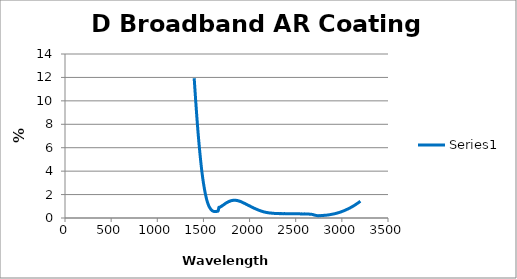
| Category | Series 0 |
|---|---|
| 1400.0 | 11.934 |
| 1410.0 | 10.726 |
| 1420.0 | 9.582 |
| 1430.0 | 8.487 |
| 1440.0 | 7.468 |
| 1450.0 | 6.535 |
| 1460.0 | 5.68 |
| 1470.0 | 4.892 |
| 1480.0 | 4.174 |
| 1490.0 | 3.551 |
| 1500.0 | 2.998 |
| 1510.0 | 2.523 |
| 1520.0 | 2.099 |
| 1530.0 | 1.743 |
| 1540.0 | 1.441 |
| 1550.0 | 1.202 |
| 1560.0 | 1.005 |
| 1570.0 | 0.864 |
| 1580.0 | 0.747 |
| 1590.0 | 0.654 |
| 1600.0 | 0.6 |
| 1610.0 | 0.568 |
| 1620.0 | 0.547 |
| 1630.0 | 0.546 |
| 1640.0 | 0.555 |
| 1650.0 | 0.588 |
| 1660.0 | 0.608 |
| 1666.280602 | 0.89 |
| 1667.30917 | 0.891 |
| 1668.337738 | 0.884 |
| 1669.366307 | 0.889 |
| 1670.394875 | 0.896 |
| 1671.423443 | 0.894 |
| 1672.452011 | 0.9 |
| 1673.48058 | 0.909 |
| 1674.509148 | 0.918 |
| 1675.537716 | 0.923 |
| 1676.566284 | 0.92 |
| 1677.594853 | 0.922 |
| 1678.623421 | 0.925 |
| 1679.651989 | 0.924 |
| 1680.680558 | 0.922 |
| 1681.709126 | 0.935 |
| 1682.737694 | 0.951 |
| 1683.766262 | 0.952 |
| 1684.794831 | 0.954 |
| 1685.823399 | 0.965 |
| 1686.851967 | 0.967 |
| 1687.880535 | 0.97 |
| 1688.909104 | 0.976 |
| 1689.937672 | 0.976 |
| 1690.96624 | 0.975 |
| 1691.994809 | 0.981 |
| 1693.023377 | 0.99 |
| 1694.051945 | 1.005 |
| 1695.080513 | 1.01 |
| 1696.109082 | 1.009 |
| 1697.13765 | 1.009 |
| 1698.166218 | 1.016 |
| 1699.194786 | 1.021 |
| 1700.223355 | 1.02 |
| 1701.251923 | 1.035 |
| 1702.280491 | 1.046 |
| 1703.30906 | 1.049 |
| 1704.337628 | 1.057 |
| 1705.366196 | 1.066 |
| 1706.394764 | 1.074 |
| 1707.423333 | 1.07 |
| 1708.451901 | 1.074 |
| 1709.480469 | 1.087 |
| 1710.509037 | 1.093 |
| 1711.537606 | 1.097 |
| 1712.566174 | 1.098 |
| 1713.594742 | 1.101 |
| 1714.623311 | 1.107 |
| 1715.651879 | 1.112 |
| 1716.680447 | 1.117 |
| 1717.709015 | 1.119 |
| 1718.737584 | 1.128 |
| 1719.766152 | 1.135 |
| 1720.79472 | 1.139 |
| 1721.823288 | 1.146 |
| 1722.851857 | 1.156 |
| 1723.880425 | 1.163 |
| 1724.908993 | 1.167 |
| 1725.937562 | 1.174 |
| 1726.96613 | 1.179 |
| 1727.994698 | 1.179 |
| 1729.023266 | 1.18 |
| 1730.051835 | 1.191 |
| 1731.080403 | 1.202 |
| 1732.108971 | 1.212 |
| 1733.137539 | 1.218 |
| 1734.166108 | 1.217 |
| 1735.194676 | 1.22 |
| 1736.223244 | 1.231 |
| 1737.251813 | 1.24 |
| 1738.280381 | 1.239 |
| 1739.308949 | 1.244 |
| 1740.337517 | 1.259 |
| 1741.366086 | 1.262 |
| 1742.394654 | 1.261 |
| 1743.423222 | 1.269 |
| 1744.45179 | 1.278 |
| 1745.480359 | 1.281 |
| 1746.508927 | 1.287 |
| 1747.537495 | 1.291 |
| 1748.566064 | 1.293 |
| 1749.594632 | 1.294 |
| 1750.6232 | 1.295 |
| 1751.651768 | 1.297 |
| 1752.680337 | 1.306 |
| 1753.708905 | 1.316 |
| 1754.737473 | 1.323 |
| 1755.766041 | 1.332 |
| 1756.79461 | 1.335 |
| 1757.823178 | 1.336 |
| 1758.851746 | 1.338 |
| 1759.880315 | 1.341 |
| 1760.908883 | 1.345 |
| 1761.937451 | 1.347 |
| 1762.966019 | 1.347 |
| 1763.994588 | 1.354 |
| 1765.023156 | 1.365 |
| 1766.051724 | 1.372 |
| 1767.080292 | 1.374 |
| 1768.108861 | 1.375 |
| 1769.137429 | 1.381 |
| 1770.165997 | 1.385 |
| 1771.194566 | 1.391 |
| 1772.223134 | 1.398 |
| 1773.251702 | 1.396 |
| 1774.28027 | 1.396 |
| 1775.308839 | 1.401 |
| 1776.337407 | 1.409 |
| 1777.365975 | 1.406 |
| 1778.394543 | 1.4 |
| 1779.423112 | 1.408 |
| 1780.45168 | 1.419 |
| 1781.480248 | 1.424 |
| 1782.508817 | 1.429 |
| 1783.537385 | 1.437 |
| 1784.565953 | 1.44 |
| 1785.594521 | 1.442 |
| 1786.62309 | 1.441 |
| 1787.651658 | 1.435 |
| 1788.680226 | 1.437 |
| 1789.708794 | 1.452 |
| 1790.737363 | 1.458 |
| 1791.765931 | 1.452 |
| 1792.794499 | 1.449 |
| 1793.823068 | 1.455 |
| 1794.851636 | 1.457 |
| 1795.880204 | 1.458 |
| 1796.908772 | 1.463 |
| 1797.937341 | 1.47 |
| 1798.965909 | 1.474 |
| 1799.994477 | 1.475 |
| 1801.023045 | 1.474 |
| 1802.051614 | 1.476 |
| 1803.080182 | 1.479 |
| 1804.10875 | 1.48 |
| 1805.137319 | 1.485 |
| 1806.165887 | 1.487 |
| 1807.194455 | 1.486 |
| 1808.223023 | 1.487 |
| 1809.251592 | 1.489 |
| 1810.28016 | 1.488 |
| 1811.308728 | 1.489 |
| 1812.337296 | 1.495 |
| 1813.365865 | 1.496 |
| 1814.394433 | 1.495 |
| 1815.423001 | 1.497 |
| 1816.45157 | 1.497 |
| 1817.480138 | 1.502 |
| 1818.508706 | 1.506 |
| 1819.537274 | 1.506 |
| 1820.565843 | 1.505 |
| 1821.594411 | 1.503 |
| 1822.622979 | 1.504 |
| 1823.651547 | 1.508 |
| 1824.680116 | 1.509 |
| 1825.708684 | 1.512 |
| 1826.737252 | 1.515 |
| 1827.765821 | 1.514 |
| 1828.794389 | 1.513 |
| 1829.822957 | 1.513 |
| 1830.851525 | 1.511 |
| 1831.880094 | 1.509 |
| 1832.908662 | 1.51 |
| 1833.93723 | 1.507 |
| 1834.965798 | 1.505 |
| 1835.994367 | 1.505 |
| 1837.022935 | 1.504 |
| 1838.051503 | 1.507 |
| 1839.080072 | 1.512 |
| 1840.10864 | 1.517 |
| 1841.137208 | 1.519 |
| 1842.165776 | 1.517 |
| 1843.194345 | 1.512 |
| 1844.222913 | 1.507 |
| 1845.251481 | 1.508 |
| 1846.280049 | 1.512 |
| 1847.308618 | 1.515 |
| 1848.337186 | 1.515 |
| 1849.365754 | 1.514 |
| 1850.394323 | 1.513 |
| 1851.422891 | 1.51 |
| 1852.451459 | 1.502 |
| 1853.480027 | 1.499 |
| 1854.508596 | 1.501 |
| 1855.537164 | 1.498 |
| 1856.565732 | 1.493 |
| 1857.5943 | 1.493 |
| 1858.622869 | 1.501 |
| 1859.651437 | 1.506 |
| 1860.680005 | 1.503 |
| 1861.708574 | 1.495 |
| 1862.737142 | 1.49 |
| 1863.76571 | 1.487 |
| 1864.794278 | 1.485 |
| 1865.822847 | 1.486 |
| 1866.851415 | 1.489 |
| 1867.879983 | 1.49 |
| 1868.908551 | 1.489 |
| 1869.93712 | 1.486 |
| 1870.965688 | 1.48 |
| 1871.994256 | 1.476 |
| 1873.022825 | 1.48 |
| 1874.051393 | 1.481 |
| 1875.079961 | 1.478 |
| 1876.108529 | 1.472 |
| 1877.137098 | 1.464 |
| 1878.165666 | 1.46 |
| 1879.194234 | 1.459 |
| 1880.222802 | 1.458 |
| 1881.251371 | 1.458 |
| 1882.279939 | 1.46 |
| 1883.308507 | 1.454 |
| 1884.337076 | 1.444 |
| 1885.365644 | 1.447 |
| 1886.394212 | 1.452 |
| 1887.42278 | 1.447 |
| 1888.451349 | 1.439 |
| 1889.479917 | 1.437 |
| 1890.508485 | 1.436 |
| 1891.537053 | 1.434 |
| 1892.565622 | 1.431 |
| 1893.59419 | 1.426 |
| 1894.622758 | 1.424 |
| 1895.651327 | 1.428 |
| 1896.679895 | 1.428 |
| 1897.708463 | 1.42 |
| 1898.737031 | 1.411 |
| 1899.7656 | 1.408 |
| 1900.794168 | 1.406 |
| 1901.822736 | 1.404 |
| 1902.851304 | 1.404 |
| 1903.879873 | 1.406 |
| 1904.908441 | 1.405 |
| 1905.937009 | 1.397 |
| 1906.965578 | 1.387 |
| 1907.994146 | 1.383 |
| 1909.022714 | 1.382 |
| 1910.051282 | 1.378 |
| 1911.079851 | 1.372 |
| 1912.108419 | 1.367 |
| 1913.136987 | 1.368 |
| 1914.165555 | 1.369 |
| 1915.194124 | 1.363 |
| 1916.222692 | 1.357 |
| 1917.25126 | 1.354 |
| 1918.279829 | 1.353 |
| 1919.308397 | 1.351 |
| 1920.336965 | 1.344 |
| 1921.365533 | 1.339 |
| 1922.394102 | 1.335 |
| 1923.42267 | 1.328 |
| 1924.451238 | 1.321 |
| 1925.479806 | 1.32 |
| 1926.508375 | 1.315 |
| 1927.536943 | 1.309 |
| 1928.565511 | 1.307 |
| 1929.59408 | 1.306 |
| 1930.622648 | 1.302 |
| 1931.651216 | 1.296 |
| 1932.679784 | 1.293 |
| 1933.708353 | 1.287 |
| 1934.736921 | 1.28 |
| 1935.765489 | 1.277 |
| 1936.794057 | 1.275 |
| 1937.822626 | 1.271 |
| 1938.851194 | 1.268 |
| 1939.879762 | 1.265 |
| 1940.908331 | 1.259 |
| 1941.936899 | 1.254 |
| 1942.965467 | 1.256 |
| 1943.994035 | 1.259 |
| 1945.022604 | 1.255 |
| 1946.051172 | 1.248 |
| 1947.07974 | 1.244 |
| 1948.108308 | 1.24 |
| 1949.136877 | 1.233 |
| 1950.165445 | 1.228 |
| 1951.194013 | 1.225 |
| 1952.222582 | 1.222 |
| 1953.25115 | 1.22 |
| 1954.279718 | 1.215 |
| 1955.308286 | 1.207 |
| 1956.336855 | 1.201 |
| 1957.365423 | 1.198 |
| 1958.393991 | 1.195 |
| 1959.422559 | 1.191 |
| 1960.451128 | 1.187 |
| 1961.479696 | 1.185 |
| 1962.508264 | 1.182 |
| 1963.536833 | 1.176 |
| 1964.565401 | 1.169 |
| 1965.593969 | 1.166 |
| 1966.622537 | 1.166 |
| 1967.651106 | 1.162 |
| 1968.679674 | 1.154 |
| 1969.708242 | 1.15 |
| 1970.73681 | 1.148 |
| 1971.765379 | 1.146 |
| 1972.793947 | 1.141 |
| 1973.822515 | 1.137 |
| 1974.851084 | 1.133 |
| 1975.879652 | 1.128 |
| 1976.90822 | 1.122 |
| 1977.936788 | 1.117 |
| 1978.965357 | 1.113 |
| 1979.993925 | 1.111 |
| 1981.022493 | 1.107 |
| 1982.051061 | 1.1 |
| 1983.07963 | 1.094 |
| 1984.108198 | 1.091 |
| 1985.136766 | 1.09 |
| 1986.165335 | 1.086 |
| 1987.193903 | 1.081 |
| 1988.222471 | 1.074 |
| 1989.251039 | 1.068 |
| 1990.279608 | 1.067 |
| 1991.308176 | 1.067 |
| 1992.336744 | 1.061 |
| 1993.365312 | 1.053 |
| 1994.393881 | 1.051 |
| 1995.422449 | 1.053 |
| 1996.451017 | 1.05 |
| 1997.479586 | 1.042 |
| 1998.508154 | 1.035 |
| 1999.536722 | 1.03 |
| 2000.56529 | 1.028 |
| 2001.593859 | 1.025 |
| 2002.622427 | 1.023 |
| 2003.650995 | 1.019 |
| 2004.679563 | 1.015 |
| 2005.708132 | 1.013 |
| 2006.7367 | 1.009 |
| 2007.765268 | 1 |
| 2008.793837 | 0.991 |
| 2009.822405 | 0.987 |
| 2010.850973 | 0.986 |
| 2011.879541 | 0.984 |
| 2012.90811 | 0.981 |
| 2013.936678 | 0.978 |
| 2014.965246 | 0.972 |
| 2015.993814 | 0.965 |
| 2017.022383 | 0.96 |
| 2018.050951 | 0.956 |
| 2019.079519 | 0.952 |
| 2020.108088 | 0.949 |
| 2021.136656 | 0.946 |
| 2022.165224 | 0.942 |
| 2023.193792 | 0.939 |
| 2024.222361 | 0.933 |
| 2025.250929 | 0.926 |
| 2026.279497 | 0.92 |
| 2027.308065 | 0.915 |
| 2028.336634 | 0.912 |
| 2029.365202 | 0.912 |
| 2030.39377 | 0.913 |
| 2031.422339 | 0.911 |
| 2032.450907 | 0.907 |
| 2033.479475 | 0.901 |
| 2034.508043 | 0.894 |
| 2035.536612 | 0.887 |
| 2036.56518 | 0.883 |
| 2037.593748 | 0.88 |
| 2038.622316 | 0.876 |
| 2039.650885 | 0.873 |
| 2040.679453 | 0.867 |
| 2041.708021 | 0.861 |
| 2042.73659 | 0.858 |
| 2043.765158 | 0.855 |
| 2044.793726 | 0.851 |
| 2045.822294 | 0.846 |
| 2046.850863 | 0.841 |
| 2047.879431 | 0.836 |
| 2048.907999 | 0.833 |
| 2049.936567 | 0.833 |
| 2050.965136 | 0.832 |
| 2051.993704 | 0.828 |
| 2053.022272 | 0.822 |
| 2054.050841 | 0.818 |
| 2055.079409 | 0.817 |
| 2056.107977 | 0.816 |
| 2057.136545 | 0.81 |
| 2058.165114 | 0.802 |
| 2059.193682 | 0.796 |
| 2060.22225 | 0.795 |
| 2061.250818 | 0.795 |
| 2062.279387 | 0.793 |
| 2063.307955 | 0.79 |
| 2064.336523 | 0.788 |
| 2065.365092 | 0.783 |
| 2066.39366 | 0.778 |
| 2067.422228 | 0.776 |
| 2068.450796 | 0.773 |
| 2069.479365 | 0.77 |
| 2070.507933 | 0.765 |
| 2071.536501 | 0.758 |
| 2072.565069 | 0.753 |
| 2073.593638 | 0.752 |
| 2074.622206 | 0.751 |
| 2075.650774 | 0.747 |
| 2076.679343 | 0.743 |
| 2077.707911 | 0.738 |
| 2078.736479 | 0.735 |
| 2079.765047 | 0.732 |
| 2080.793616 | 0.727 |
| 2081.822184 | 0.723 |
| 2082.850752 | 0.721 |
| 2083.87932 | 0.718 |
| 2084.907889 | 0.714 |
| 2085.936457 | 0.709 |
| 2086.965025 | 0.706 |
| 2087.993594 | 0.702 |
| 2089.022162 | 0.698 |
| 2090.05073 | 0.696 |
| 2091.079298 | 0.695 |
| 2092.107867 | 0.692 |
| 2093.136435 | 0.689 |
| 2094.165003 | 0.686 |
| 2095.193571 | 0.684 |
| 2096.22214 | 0.681 |
| 2097.250708 | 0.675 |
| 2098.279276 | 0.668 |
| 2099.307845 | 0.664 |
| 2100.336413 | 0.663 |
| 2101.364981 | 0.662 |
| 2102.393549 | 0.658 |
| 2103.422118 | 0.654 |
| 2104.450686 | 0.653 |
| 2105.479254 | 0.652 |
| 2106.507822 | 0.649 |
| 2107.536391 | 0.647 |
| 2108.564959 | 0.645 |
| 2109.593527 | 0.642 |
| 2110.622096 | 0.636 |
| 2111.650664 | 0.63 |
| 2112.679232 | 0.627 |
| 2113.7078 | 0.627 |
| 2114.736369 | 0.625 |
| 2115.764937 | 0.622 |
| 2116.793505 | 0.619 |
| 2117.822073 | 0.614 |
| 2118.850642 | 0.609 |
| 2119.87921 | 0.605 |
| 2120.907778 | 0.602 |
| 2121.936347 | 0.6 |
| 2122.964915 | 0.598 |
| 2123.993483 | 0.595 |
| 2125.022051 | 0.593 |
| 2126.05062 | 0.593 |
| 2127.079188 | 0.592 |
| 2128.107756 | 0.588 |
| 2129.136324 | 0.583 |
| 2130.164893 | 0.58 |
| 2131.193461 | 0.578 |
| 2132.222029 | 0.574 |
| 2133.250598 | 0.571 |
| 2134.279166 | 0.569 |
| 2135.307734 | 0.568 |
| 2136.336302 | 0.567 |
| 2137.364871 | 0.566 |
| 2138.393439 | 0.564 |
| 2139.422007 | 0.561 |
| 2140.450575 | 0.557 |
| 2141.479144 | 0.554 |
| 2142.507712 | 0.552 |
| 2143.53628 | 0.551 |
| 2144.564849 | 0.548 |
| 2145.593417 | 0.544 |
| 2146.621985 | 0.543 |
| 2147.650553 | 0.542 |
| 2148.679122 | 0.538 |
| 2149.70769 | 0.531 |
| 2150.736258 | 0.528 |
| 2151.764826 | 0.528 |
| 2152.793395 | 0.528 |
| 2153.821963 | 0.525 |
| 2154.850531 | 0.522 |
| 2155.8791 | 0.519 |
| 2156.907668 | 0.517 |
| 2157.936236 | 0.514 |
| 2158.964804 | 0.512 |
| 2159.993373 | 0.511 |
| 2161.021941 | 0.51 |
| 2162.050509 | 0.508 |
| 2163.079077 | 0.506 |
| 2164.107646 | 0.504 |
| 2165.136214 | 0.503 |
| 2166.164782 | 0.502 |
| 2167.193351 | 0.502 |
| 2168.221919 | 0.501 |
| 2169.250487 | 0.499 |
| 2170.279055 | 0.495 |
| 2171.307624 | 0.491 |
| 2172.336192 | 0.488 |
| 2173.36476 | 0.485 |
| 2174.393328 | 0.483 |
| 2175.421897 | 0.481 |
| 2176.450465 | 0.482 |
| 2177.479033 | 0.481 |
| 2178.507602 | 0.479 |
| 2179.53617 | 0.477 |
| 2180.564738 | 0.477 |
| 2181.593306 | 0.478 |
| 2182.621875 | 0.477 |
| 2183.650443 | 0.474 |
| 2184.679011 | 0.471 |
| 2185.707579 | 0.469 |
| 2186.736148 | 0.467 |
| 2187.764716 | 0.466 |
| 2188.793284 | 0.465 |
| 2189.821853 | 0.464 |
| 2190.850421 | 0.463 |
| 2191.878989 | 0.461 |
| 2192.907557 | 0.461 |
| 2193.936126 | 0.46 |
| 2194.964694 | 0.457 |
| 2195.993262 | 0.455 |
| 2197.02183 | 0.453 |
| 2198.050399 | 0.452 |
| 2199.078967 | 0.451 |
| 2200.107535 | 0.449 |
| 2201.136104 | 0.447 |
| 2202.164672 | 0.445 |
| 2203.19324 | 0.445 |
| 2204.221808 | 0.444 |
| 2205.250377 | 0.442 |
| 2206.278945 | 0.44 |
| 2207.307513 | 0.438 |
| 2208.336081 | 0.438 |
| 2209.36465 | 0.439 |
| 2210.393218 | 0.44 |
| 2211.421786 | 0.439 |
| 2212.450355 | 0.435 |
| 2213.478923 | 0.432 |
| 2214.507491 | 0.432 |
| 2215.536059 | 0.433 |
| 2216.564628 | 0.433 |
| 2217.593196 | 0.433 |
| 2218.621764 | 0.432 |
| 2219.650332 | 0.43 |
| 2220.678901 | 0.429 |
| 2221.707469 | 0.427 |
| 2222.736037 | 0.425 |
| 2223.764606 | 0.423 |
| 2224.793174 | 0.424 |
| 2225.821742 | 0.426 |
| 2226.85031 | 0.428 |
| 2227.878879 | 0.426 |
| 2228.907447 | 0.423 |
| 2229.936015 | 0.419 |
| 2230.964583 | 0.418 |
| 2231.993152 | 0.419 |
| 2233.02172 | 0.42 |
| 2234.050288 | 0.421 |
| 2235.078857 | 0.422 |
| 2236.107425 | 0.42 |
| 2237.135993 | 0.416 |
| 2238.164561 | 0.414 |
| 2239.19313 | 0.415 |
| 2240.221698 | 0.416 |
| 2241.250266 | 0.415 |
| 2242.278834 | 0.412 |
| 2243.307403 | 0.41 |
| 2244.335971 | 0.408 |
| 2245.364539 | 0.406 |
| 2246.393108 | 0.404 |
| 2247.421676 | 0.404 |
| 2248.450244 | 0.404 |
| 2249.478812 | 0.403 |
| 2250.507381 | 0.402 |
| 2251.535949 | 0.401 |
| 2252.564517 | 0.402 |
| 2253.593085 | 0.402 |
| 2254.621654 | 0.401 |
| 2255.650222 | 0.399 |
| 2256.67879 | 0.398 |
| 2257.707359 | 0.398 |
| 2258.735927 | 0.398 |
| 2259.764495 | 0.399 |
| 2260.793063 | 0.399 |
| 2261.821632 | 0.398 |
| 2262.8502 | 0.397 |
| 2263.878768 | 0.396 |
| 2264.907336 | 0.396 |
| 2265.935905 | 0.394 |
| 2266.964473 | 0.393 |
| 2267.993041 | 0.391 |
| 2269.02161 | 0.391 |
| 2270.050178 | 0.391 |
| 2271.078746 | 0.391 |
| 2272.107314 | 0.392 |
| 2273.135883 | 0.393 |
| 2274.164451 | 0.393 |
| 2275.193019 | 0.391 |
| 2276.221587 | 0.388 |
| 2277.250156 | 0.386 |
| 2278.278724 | 0.386 |
| 2279.307292 | 0.387 |
| 2280.335861 | 0.389 |
| 2281.364429 | 0.389 |
| 2282.392997 | 0.388 |
| 2283.421565 | 0.388 |
| 2284.450134 | 0.388 |
| 2285.478702 | 0.389 |
| 2286.50727 | 0.388 |
| 2287.535838 | 0.385 |
| 2288.564407 | 0.381 |
| 2289.592975 | 0.38 |
| 2290.621543 | 0.38 |
| 2291.650112 | 0.382 |
| 2292.67868 | 0.383 |
| 2293.707248 | 0.382 |
| 2294.735816 | 0.38 |
| 2295.764385 | 0.38 |
| 2296.792953 | 0.379 |
| 2297.821521 | 0.379 |
| 2298.850089 | 0.379 |
| 2299.878658 | 0.378 |
| 2300.907226 | 0.378 |
| 2301.935794 | 0.379 |
| 2302.964363 | 0.379 |
| 2303.992931 | 0.379 |
| 2305.021499 | 0.38 |
| 2306.050067 | 0.382 |
| 2307.078636 | 0.383 |
| 2308.107204 | 0.383 |
| 2309.135772 | 0.382 |
| 2310.16434 | 0.382 |
| 2311.192909 | 0.381 |
| 2312.221477 | 0.379 |
| 2313.250045 | 0.378 |
| 2314.278614 | 0.378 |
| 2315.307182 | 0.377 |
| 2316.33575 | 0.376 |
| 2317.364318 | 0.376 |
| 2318.392887 | 0.377 |
| 2319.421455 | 0.376 |
| 2320.450023 | 0.374 |
| 2321.478591 | 0.373 |
| 2322.50716 | 0.373 |
| 2323.535728 | 0.375 |
| 2324.564296 | 0.375 |
| 2325.592865 | 0.375 |
| 2326.621433 | 0.374 |
| 2327.650001 | 0.372 |
| 2328.678569 | 0.371 |
| 2329.707138 | 0.371 |
| 2330.735706 | 0.372 |
| 2331.764274 | 0.374 |
| 2332.792842 | 0.375 |
| 2333.821411 | 0.374 |
| 2334.849979 | 0.373 |
| 2335.878547 | 0.372 |
| 2336.907116 | 0.372 |
| 2337.935684 | 0.374 |
| 2338.964252 | 0.375 |
| 2339.99282 | 0.375 |
| 2341.021389 | 0.374 |
| 2342.049957 | 0.373 |
| 2343.078525 | 0.372 |
| 2344.107093 | 0.371 |
| 2345.135662 | 0.371 |
| 2346.16423 | 0.372 |
| 2347.192798 | 0.374 |
| 2348.221367 | 0.375 |
| 2349.249935 | 0.375 |
| 2350.278503 | 0.376 |
| 2351.307071 | 0.376 |
| 2352.33564 | 0.375 |
| 2353.364208 | 0.374 |
| 2354.392776 | 0.374 |
| 2355.421344 | 0.372 |
| 2356.449913 | 0.371 |
| 2357.478481 | 0.37 |
| 2358.507049 | 0.37 |
| 2359.535618 | 0.371 |
| 2360.564186 | 0.371 |
| 2361.592754 | 0.371 |
| 2362.621322 | 0.369 |
| 2363.649891 | 0.369 |
| 2364.678459 | 0.37 |
| 2365.707027 | 0.372 |
| 2366.735595 | 0.373 |
| 2367.764164 | 0.373 |
| 2368.792732 | 0.373 |
| 2369.8213 | 0.371 |
| 2370.849869 | 0.369 |
| 2371.878437 | 0.37 |
| 2372.907005 | 0.372 |
| 2373.935573 | 0.375 |
| 2374.964142 | 0.376 |
| 2375.99271 | 0.376 |
| 2377.021278 | 0.375 |
| 2378.049846 | 0.375 |
| 2379.078415 | 0.374 |
| 2380.106983 | 0.374 |
| 2381.135551 | 0.374 |
| 2382.16412 | 0.373 |
| 2383.192688 | 0.371 |
| 2384.221256 | 0.368 |
| 2385.249824 | 0.367 |
| 2386.278393 | 0.369 |
| 2387.306961 | 0.371 |
| 2388.335529 | 0.372 |
| 2389.364097 | 0.372 |
| 2390.392666 | 0.371 |
| 2391.421234 | 0.371 |
| 2392.449802 | 0.371 |
| 2393.478371 | 0.371 |
| 2394.506939 | 0.372 |
| 2395.535507 | 0.371 |
| 2396.564075 | 0.371 |
| 2397.592644 | 0.37 |
| 2398.621212 | 0.369 |
| 2399.64978 | 0.369 |
| 2400.678348 | 0.37 |
| 2401.706917 | 0.37 |
| 2402.735485 | 0.369 |
| 2403.764053 | 0.368 |
| 2404.792622 | 0.367 |
| 2405.82119 | 0.367 |
| 2406.849758 | 0.368 |
| 2407.878326 | 0.369 |
| 2408.906895 | 0.369 |
| 2409.935463 | 0.37 |
| 2410.964031 | 0.371 |
| 2411.992599 | 0.372 |
| 2413.021168 | 0.371 |
| 2414.049736 | 0.37 |
| 2415.078304 | 0.368 |
| 2416.106873 | 0.368 |
| 2417.135441 | 0.368 |
| 2418.164009 | 0.369 |
| 2419.192577 | 0.369 |
| 2420.221146 | 0.369 |
| 2421.249714 | 0.368 |
| 2422.278282 | 0.367 |
| 2423.30685 | 0.366 |
| 2424.335419 | 0.366 |
| 2425.363987 | 0.366 |
| 2426.392555 | 0.366 |
| 2427.421124 | 0.365 |
| 2428.449692 | 0.364 |
| 2429.47826 | 0.364 |
| 2430.506828 | 0.364 |
| 2431.535397 | 0.365 |
| 2432.563965 | 0.366 |
| 2433.592533 | 0.366 |
| 2434.621101 | 0.365 |
| 2435.64967 | 0.365 |
| 2436.678238 | 0.364 |
| 2437.706806 | 0.364 |
| 2438.735375 | 0.362 |
| 2439.763943 | 0.361 |
| 2440.792511 | 0.361 |
| 2441.821079 | 0.361 |
| 2442.849648 | 0.361 |
| 2443.878216 | 0.361 |
| 2444.906784 | 0.36 |
| 2445.935352 | 0.36 |
| 2446.963921 | 0.361 |
| 2447.992489 | 0.363 |
| 2449.021057 | 0.364 |
| 2450.049626 | 0.363 |
| 2451.078194 | 0.361 |
| 2452.106762 | 0.359 |
| 2453.13533 | 0.358 |
| 2454.163899 | 0.358 |
| 2455.192467 | 0.359 |
| 2456.221035 | 0.359 |
| 2457.249603 | 0.36 |
| 2458.278172 | 0.361 |
| 2459.30674 | 0.362 |
| 2460.335308 | 0.364 |
| 2461.363877 | 0.365 |
| 2462.392445 | 0.365 |
| 2463.421013 | 0.363 |
| 2464.449581 | 0.362 |
| 2465.47815 | 0.361 |
| 2466.506718 | 0.361 |
| 2467.535286 | 0.362 |
| 2468.563854 | 0.362 |
| 2469.592423 | 0.363 |
| 2470.620991 | 0.363 |
| 2471.649559 | 0.362 |
| 2472.678128 | 0.361 |
| 2473.706696 | 0.361 |
| 2474.735264 | 0.361 |
| 2475.763832 | 0.361 |
| 2476.792401 | 0.362 |
| 2477.820969 | 0.362 |
| 2478.849537 | 0.362 |
| 2479.878105 | 0.362 |
| 2480.906674 | 0.363 |
| 2481.935242 | 0.362 |
| 2482.96381 | 0.362 |
| 2483.992379 | 0.361 |
| 2485.020947 | 0.36 |
| 2486.049515 | 0.359 |
| 2487.078083 | 0.359 |
| 2488.106652 | 0.36 |
| 2489.13522 | 0.361 |
| 2490.163788 | 0.361 |
| 2491.192356 | 0.36 |
| 2492.220925 | 0.359 |
| 2493.249493 | 0.36 |
| 2494.278061 | 0.361 |
| 2495.30663 | 0.361 |
| 2496.335198 | 0.362 |
| 2497.363766 | 0.362 |
| 2498.392334 | 0.363 |
| 2499.420903 | 0.362 |
| 2500.449471 | 0.36 |
| 2501.478039 | 0.359 |
| 2502.506607 | 0.359 |
| 2503.535176 | 0.359 |
| 2504.563744 | 0.358 |
| 2505.592312 | 0.358 |
| 2506.620881 | 0.359 |
| 2507.649449 | 0.36 |
| 2508.678017 | 0.361 |
| 2509.706585 | 0.361 |
| 2510.735154 | 0.36 |
| 2511.763722 | 0.358 |
| 2512.79229 | 0.357 |
| 2513.820858 | 0.355 |
| 2514.849427 | 0.354 |
| 2515.877995 | 0.354 |
| 2516.906563 | 0.355 |
| 2517.935132 | 0.355 |
| 2518.9637 | 0.355 |
| 2519.992268 | 0.355 |
| 2521.020836 | 0.355 |
| 2522.049405 | 0.356 |
| 2523.077973 | 0.356 |
| 2524.106541 | 0.355 |
| 2525.135109 | 0.355 |
| 2526.163678 | 0.354 |
| 2527.192246 | 0.354 |
| 2528.220814 | 0.353 |
| 2529.249382 | 0.354 |
| 2530.277951 | 0.355 |
| 2531.306519 | 0.357 |
| 2532.335087 | 0.358 |
| 2533.363656 | 0.359 |
| 2534.392224 | 0.359 |
| 2535.420792 | 0.359 |
| 2536.44936 | 0.357 |
| 2537.477929 | 0.356 |
| 2538.506497 | 0.354 |
| 2539.535065 | 0.353 |
| 2540.563633 | 0.353 |
| 2541.592202 | 0.353 |
| 2542.62077 | 0.354 |
| 2543.649338 | 0.354 |
| 2544.677907 | 0.354 |
| 2545.706475 | 0.354 |
| 2546.735043 | 0.354 |
| 2547.763611 | 0.352 |
| 2548.79218 | 0.351 |
| 2549.820748 | 0.349 |
| 2550.849316 | 0.348 |
| 2551.877884 | 0.349 |
| 2552.906453 | 0.35 |
| 2553.935021 | 0.351 |
| 2554.963589 | 0.351 |
| 2555.992158 | 0.351 |
| 2557.020726 | 0.351 |
| 2558.049294 | 0.351 |
| 2559.077862 | 0.353 |
| 2560.106431 | 0.354 |
| 2561.134999 | 0.355 |
| 2562.163567 | 0.355 |
| 2563.192135 | 0.354 |
| 2564.220704 | 0.35 |
| 2565.249272 | 0.347 |
| 2566.27784 | 0.345 |
| 2567.306409 | 0.344 |
| 2568.334977 | 0.345 |
| 2569.363545 | 0.345 |
| 2570.392113 | 0.345 |
| 2571.420682 | 0.344 |
| 2572.44925 | 0.345 |
| 2573.477818 | 0.345 |
| 2574.506386 | 0.345 |
| 2575.534955 | 0.346 |
| 2576.563523 | 0.346 |
| 2577.592091 | 0.346 |
| 2578.62066 | 0.345 |
| 2579.649228 | 0.346 |
| 2580.677796 | 0.347 |
| 2581.706364 | 0.347 |
| 2582.734933 | 0.347 |
| 2583.763501 | 0.345 |
| 2584.792069 | 0.344 |
| 2585.820637 | 0.343 |
| 2586.849206 | 0.344 |
| 2587.877774 | 0.344 |
| 2588.906342 | 0.345 |
| 2589.934911 | 0.346 |
| 2590.963479 | 0.347 |
| 2591.992047 | 0.349 |
| 2593.020615 | 0.352 |
| 2594.049184 | 0.354 |
| 2595.077752 | 0.353 |
| 2596.10632 | 0.348 |
| 2597.134888 | 0.344 |
| 2598.163457 | 0.342 |
| 2599.192025 | 0.342 |
| 2600.220593 | 0.344 |
| 2601.249162 | 0.346 |
| 2602.27773 | 0.348 |
| 2603.306298 | 0.348 |
| 2604.334866 | 0.347 |
| 2605.363435 | 0.345 |
| 2606.392003 | 0.343 |
| 2607.420571 | 0.34 |
| 2608.449139 | 0.34 |
| 2609.477708 | 0.341 |
| 2610.506276 | 0.342 |
| 2611.534844 | 0.342 |
| 2612.563413 | 0.342 |
| 2613.591981 | 0.343 |
| 2614.620549 | 0.344 |
| 2615.649117 | 0.345 |
| 2616.677686 | 0.345 |
| 2617.706254 | 0.344 |
| 2618.734822 | 0.342 |
| 2619.76339 | 0.339 |
| 2620.791959 | 0.337 |
| 2621.820527 | 0.335 |
| 2622.849095 | 0.335 |
| 2623.877664 | 0.336 |
| 2624.906232 | 0.337 |
| 2625.9348 | 0.338 |
| 2626.963368 | 0.338 |
| 2627.991937 | 0.339 |
| 2629.020505 | 0.339 |
| 2630.049073 | 0.339 |
| 2631.077641 | 0.337 |
| 2632.10621 | 0.334 |
| 2633.134778 | 0.333 |
| 2634.163346 | 0.333 |
| 2635.191915 | 0.332 |
| 2636.220483 | 0.331 |
| 2637.249051 | 0.331 |
| 2638.277619 | 0.332 |
| 2639.306188 | 0.333 |
| 2640.334756 | 0.334 |
| 2641.363324 | 0.335 |
| 2642.391892 | 0.335 |
| 2643.420461 | 0.335 |
| 2644.449029 | 0.334 |
| 2645.477597 | 0.332 |
| 2646.506166 | 0.331 |
| 2647.534734 | 0.329 |
| 2648.563302 | 0.329 |
| 2649.59187 | 0.329 |
| 2650.620439 | 0.33 |
| 2651.649007 | 0.329 |
| 2652.677575 | 0.328 |
| 2653.706143 | 0.327 |
| 2654.734712 | 0.326 |
| 2655.76328 | 0.324 |
| 2656.791848 | 0.324 |
| 2657.820417 | 0.324 |
| 2658.848985 | 0.326 |
| 2659.877553 | 0.327 |
| 2660.906121 | 0.328 |
| 2661.93469 | 0.328 |
| 2662.963258 | 0.328 |
| 2663.991826 | 0.328 |
| 2665.020394 | 0.328 |
| 2666.048963 | 0.325 |
| 2667.077531 | 0.321 |
| 2668.106099 | 0.319 |
| 2669.134668 | 0.317 |
| 2670.163236 | 0.317 |
| 2671.191804 | 0.314 |
| 2672.220372 | 0.311 |
| 2673.248941 | 0.31 |
| 2674.277509 | 0.309 |
| 2675.306077 | 0.31 |
| 2676.334645 | 0.31 |
| 2677.363214 | 0.309 |
| 2678.391782 | 0.307 |
| 2679.42035 | 0.306 |
| 2680.448919 | 0.304 |
| 2681.477487 | 0.303 |
| 2682.506055 | 0.302 |
| 2683.534623 | 0.3 |
| 2684.563192 | 0.297 |
| 2685.59176 | 0.294 |
| 2686.620328 | 0.291 |
| 2687.648896 | 0.288 |
| 2688.677465 | 0.286 |
| 2689.706033 | 0.283 |
| 2690.734601 | 0.281 |
| 2691.76317 | 0.279 |
| 2692.791738 | 0.276 |
| 2693.820306 | 0.274 |
| 2694.848874 | 0.27 |
| 2695.877443 | 0.266 |
| 2696.906011 | 0.263 |
| 2697.934579 | 0.262 |
| 2698.963147 | 0.261 |
| 2699.991716 | 0.26 |
| 2701.020284 | 0.259 |
| 2702.048852 | 0.256 |
| 2703.077421 | 0.254 |
| 2704.105989 | 0.252 |
| 2705.134557 | 0.249 |
| 2706.163125 | 0.247 |
| 2707.191694 | 0.244 |
| 2708.220262 | 0.241 |
| 2709.24883 | 0.238 |
| 2710.277398 | 0.235 |
| 2711.305967 | 0.232 |
| 2712.334535 | 0.229 |
| 2713.363103 | 0.229 |
| 2714.391672 | 0.228 |
| 2715.42024 | 0.227 |
| 2716.448808 | 0.226 |
| 2717.477376 | 0.224 |
| 2718.505945 | 0.223 |
| 2719.534513 | 0.222 |
| 2720.563081 | 0.222 |
| 2721.591649 | 0.221 |
| 2722.620218 | 0.218 |
| 2723.648786 | 0.216 |
| 2724.677354 | 0.213 |
| 2725.705923 | 0.212 |
| 2726.734491 | 0.211 |
| 2727.763059 | 0.21 |
| 2728.791627 | 0.209 |
| 2729.820196 | 0.207 |
| 2730.848764 | 0.206 |
| 2731.877332 | 0.204 |
| 2732.9059 | 0.203 |
| 2733.934469 | 0.202 |
| 2734.963037 | 0.2 |
| 2735.991605 | 0.199 |
| 2737.020174 | 0.198 |
| 2738.048742 | 0.199 |
| 2739.07731 | 0.2 |
| 2740.105878 | 0.201 |
| 2741.134447 | 0.202 |
| 2742.163015 | 0.203 |
| 2743.191583 | 0.202 |
| 2744.220151 | 0.202 |
| 2745.24872 | 0.2 |
| 2746.277288 | 0.199 |
| 2747.305856 | 0.199 |
| 2748.334425 | 0.199 |
| 2749.362993 | 0.201 |
| 2750.391561 | 0.202 |
| 2751.420129 | 0.203 |
| 2752.448698 | 0.204 |
| 2753.477266 | 0.203 |
| 2754.505834 | 0.203 |
| 2755.5344020000002 | 0.203 |
| 2756.562971 | 0.203 |
| 2757.591539 | 0.203 |
| 2758.620107 | 0.202 |
| 2759.648676 | 0.202 |
| 2760.677244 | 0.202 |
| 2761.705812 | 0.202 |
| 2762.73438 | 0.202 |
| 2763.762949 | 0.202 |
| 2764.791517 | 0.201 |
| 2765.820085 | 0.201 |
| 2766.848653 | 0.201 |
| 2767.877222 | 0.201 |
| 2768.90579 | 0.202 |
| 2769.934358 | 0.202 |
| 2770.962927 | 0.203 |
| 2771.991495 | 0.204 |
| 2773.020063 | 0.205 |
| 2774.048631 | 0.206 |
| 2775.0772 | 0.206 |
| 2776.105768 | 0.207 |
| 2777.134336 | 0.207 |
| 2778.162904 | 0.208 |
| 2779.191473 | 0.207 |
| 2780.220041 | 0.207 |
| 2781.248609 | 0.207 |
| 2782.277178 | 0.207 |
| 2783.305746 | 0.207 |
| 2784.334314 | 0.208 |
| 2785.362882 | 0.21 |
| 2786.391451 | 0.211 |
| 2787.420019 | 0.212 |
| 2788.448587 | 0.213 |
| 2789.477155 | 0.213 |
| 2790.505724 | 0.214 |
| 2791.534292 | 0.215 |
| 2792.56286 | 0.216 |
| 2793.591429 | 0.216 |
| 2794.619997 | 0.217 |
| 2795.648565 | 0.217 |
| 2796.677133 | 0.218 |
| 2797.705702 | 0.22 |
| 2798.73427 | 0.222 |
| 2799.762838 | 0.224 |
| 2800.791406 | 0.225 |
| 2801.819975 | 0.225 |
| 2802.848543 | 0.224 |
| 2803.877111 | 0.223 |
| 2804.90568 | 0.222 |
| 2805.934248 | 0.222 |
| 2806.962816 | 0.223 |
| 2807.991384 | 0.225 |
| 2809.019953 | 0.227 |
| 2810.048521 | 0.228 |
| 2811.077089 | 0.229 |
| 2812.105657 | 0.229 |
| 2813.134226 | 0.229 |
| 2814.162794 | 0.23 |
| 2815.191362 | 0.231 |
| 2816.219931 | 0.232 |
| 2817.248499 | 0.233 |
| 2818.277067 | 0.234 |
| 2819.305635 | 0.235 |
| 2820.334204 | 0.236 |
| 2821.362772 | 0.237 |
| 2822.39134 | 0.238 |
| 2823.419908 | 0.238 |
| 2824.448477 | 0.238 |
| 2825.477045 | 0.237 |
| 2826.505613 | 0.237 |
| 2827.534182 | 0.237 |
| 2828.56275 | 0.238 |
| 2829.591318 | 0.24 |
| 2830.619886 | 0.241 |
| 2831.648455 | 0.243 |
| 2832.677023 | 0.244 |
| 2833.705591 | 0.245 |
| 2834.734159 | 0.245 |
| 2835.762728 | 0.245 |
| 2836.791296 | 0.246 |
| 2837.819864 | 0.247 |
| 2838.848433 | 0.248 |
| 2839.877001 | 0.25 |
| 2840.905569 | 0.251 |
| 2841.934137 | 0.252 |
| 2842.962706 | 0.254 |
| 2843.991274 | 0.255 |
| 2845.019842 | 0.256 |
| 2846.04841 | 0.257 |
| 2847.076979 | 0.258 |
| 2848.105547 | 0.26 |
| 2849.134115 | 0.261 |
| 2850.162684 | 0.262 |
| 2851.191252 | 0.262 |
| 2852.21982 | 0.261 |
| 2853.248388 | 0.261 |
| 2854.276957 | 0.262 |
| 2855.305525 | 0.263 |
| 2856.334093 | 0.265 |
| 2857.362661 | 0.267 |
| 2858.39123 | 0.269 |
| 2859.419798 | 0.271 |
| 2860.448366 | 0.273 |
| 2861.476935 | 0.274 |
| 2862.505503 | 0.276 |
| 2863.534071 | 0.277 |
| 2864.562639 | 0.278 |
| 2865.591208 | 0.279 |
| 2866.619776 | 0.28 |
| 2867.648344 | 0.281 |
| 2868.676912 | 0.282 |
| 2869.705481 | 0.284 |
| 2870.734049 | 0.286 |
| 2871.762617 | 0.287 |
| 2872.791186 | 0.289 |
| 2873.819754 | 0.291 |
| 2874.848322 | 0.292 |
| 2875.87689 | 0.294 |
| 2876.905459 | 0.295 |
| 2877.934027 | 0.297 |
| 2878.962595 | 0.298 |
| 2879.991163 | 0.3 |
| 2881.019732 | 0.302 |
| 2882.0483 | 0.303 |
| 2883.076868 | 0.304 |
| 2884.105437 | 0.305 |
| 2885.134005 | 0.307 |
| 2886.162573 | 0.309 |
| 2887.191141 | 0.311 |
| 2888.21971 | 0.312 |
| 2889.248278 | 0.314 |
| 2890.276846 | 0.314 |
| 2891.305414 | 0.316 |
| 2892.333983 | 0.318 |
| 2893.362551 | 0.32 |
| 2894.391119 | 0.322 |
| 2895.419688 | 0.323 |
| 2896.448256 | 0.325 |
| 2897.476824 | 0.327 |
| 2898.505392 | 0.328 |
| 2899.533961 | 0.33 |
| 2900.562529 | 0.331 |
| 2901.591097 | 0.332 |
| 2902.619665 | 0.334 |
| 2903.648234 | 0.335 |
| 2904.676802 | 0.337 |
| 2905.70537 | 0.338 |
| 2906.733939 | 0.34 |
| 2907.762507 | 0.34 |
| 2908.791075 | 0.341 |
| 2909.819643 | 0.342 |
| 2910.848212 | 0.344 |
| 2911.87678 | 0.346 |
| 2912.905348 | 0.348 |
| 2913.933916 | 0.35 |
| 2914.962485 | 0.352 |
| 2915.991053 | 0.354 |
| 2917.019621 | 0.356 |
| 2918.04819 | 0.358 |
| 2919.076758 | 0.36 |
| 2920.105326 | 0.362 |
| 2921.133894 | 0.364 |
| 2922.162463 | 0.366 |
| 2923.191031 | 0.367 |
| 2924.219599 | 0.369 |
| 2925.248167 | 0.37 |
| 2926.276736 | 0.372 |
| 2927.305304 | 0.374 |
| 2928.333872 | 0.376 |
| 2929.362441 | 0.379 |
| 2930.391009 | 0.382 |
| 2931.419577 | 0.384 |
| 2932.448145 | 0.386 |
| 2933.476714 | 0.389 |
| 2934.505282 | 0.391 |
| 2935.53385 | 0.393 |
| 2936.562418 | 0.395 |
| 2937.590987 | 0.397 |
| 2938.619555 | 0.399 |
| 2939.648123 | 0.4 |
| 2940.676692 | 0.402 |
| 2941.70526 | 0.404 |
| 2942.733828 | 0.406 |
| 2943.762396 | 0.409 |
| 2944.790965 | 0.411 |
| 2945.819533 | 0.413 |
| 2946.848101 | 0.415 |
| 2947.876669 | 0.416 |
| 2948.905238 | 0.419 |
| 2949.933806 | 0.421 |
| 2950.962374 | 0.425 |
| 2951.990943 | 0.428 |
| 2953.019511 | 0.43 |
| 2954.048079 | 0.433 |
| 2955.076647 | 0.435 |
| 2956.105216 | 0.437 |
| 2957.133784 | 0.44 |
| 2958.162352 | 0.442 |
| 2959.19092 | 0.445 |
| 2960.219489 | 0.447 |
| 2961.248057 | 0.45 |
| 2962.276625 | 0.452 |
| 2963.305194 | 0.454 |
| 2964.333762 | 0.456 |
| 2965.36233 | 0.458 |
| 2966.390898 | 0.46 |
| 2967.419467 | 0.462 |
| 2968.448035 | 0.465 |
| 2969.476603 | 0.468 |
| 2970.505171 | 0.472 |
| 2971.53374 | 0.475 |
| 2972.562308 | 0.478 |
| 2973.590876 | 0.48 |
| 2974.619445 | 0.482 |
| 2975.648013 | 0.483 |
| 2976.676581 | 0.485 |
| 2977.705149 | 0.487 |
| 2978.733718 | 0.49 |
| 2979.762286 | 0.493 |
| 2980.790854 | 0.497 |
| 2981.819422 | 0.5 |
| 2982.847991 | 0.502 |
| 2983.876559 | 0.505 |
| 2984.905127 | 0.507 |
| 2985.933696 | 0.51 |
| 2986.962264 | 0.512 |
| 2987.990832 | 0.516 |
| 2989.0194 | 0.519 |
| 2990.047969 | 0.522 |
| 2991.076537 | 0.525 |
| 2992.105105 | 0.528 |
| 2993.133673 | 0.531 |
| 2994.162242 | 0.534 |
| 2995.19081 | 0.537 |
| 2996.219378 | 0.541 |
| 2997.247947 | 0.544 |
| 2998.276515 | 0.547 |
| 2999.305083 | 0.55 |
| 3000.333651 | 0.553 |
| 3001.36222 | 0.556 |
| 3002.390788 | 0.559 |
| 3003.419356 | 0.562 |
| 3004.447924 | 0.565 |
| 3005.476493 | 0.568 |
| 3006.505061 | 0.571 |
| 3007.533629 | 0.574 |
| 3008.562198 | 0.577 |
| 3009.590766 | 0.58 |
| 3010.619334 | 0.583 |
| 3011.647902 | 0.586 |
| 3012.676471 | 0.589 |
| 3013.705039 | 0.593 |
| 3014.733607 | 0.596 |
| 3015.762175 | 0.599 |
| 3016.790744 | 0.602 |
| 3017.819312 | 0.605 |
| 3018.84788 | 0.608 |
| 3019.876449 | 0.61 |
| 3020.905017 | 0.613 |
| 3021.933585 | 0.616 |
| 3022.962153 | 0.619 |
| 3023.990722 | 0.622 |
| 3025.01929 | 0.625 |
| 3026.047858 | 0.629 |
| 3027.076426 | 0.633 |
| 3028.104995 | 0.638 |
| 3029.133563 | 0.642 |
| 3030.162131 | 0.646 |
| 3031.1907 | 0.649 |
| 3032.219268 | 0.652 |
| 3033.247836 | 0.654 |
| 3034.276404 | 0.657 |
| 3035.304973 | 0.66 |
| 3036.333541 | 0.663 |
| 3037.362109 | 0.667 |
| 3038.390677 | 0.67 |
| 3039.419246 | 0.674 |
| 3040.447814 | 0.678 |
| 3041.476382 | 0.682 |
| 3042.504951 | 0.686 |
| 3043.533519 | 0.69 |
| 3044.562087 | 0.695 |
| 3045.590655 | 0.699 |
| 3046.619224 | 0.704 |
| 3047.647792 | 0.708 |
| 3048.67636 | 0.712 |
| 3049.704928 | 0.715 |
| 3050.733497 | 0.719 |
| 3051.762065 | 0.723 |
| 3052.790633 | 0.728 |
| 3053.819202 | 0.732 |
| 3054.84777 | 0.736 |
| 3055.876338 | 0.739 |
| 3056.904906 | 0.742 |
| 3057.933475 | 0.745 |
| 3058.962043 | 0.748 |
| 3059.990611 | 0.752 |
| 3061.019179 | 0.755 |
| 3062.047748 | 0.759 |
| 3063.076316 | 0.763 |
| 3064.104884 | 0.768 |
| 3065.133453 | 0.772 |
| 3066.162021 | 0.777 |
| 3067.190589 | 0.781 |
| 3068.219157 | 0.785 |
| 3069.247726 | 0.788 |
| 3070.276294 | 0.792 |
| 3071.304862 | 0.795 |
| 3072.33343 | 0.799 |
| 3073.361999 | 0.803 |
| 3074.390567 | 0.807 |
| 3075.419135 | 0.812 |
| 3076.447704 | 0.816 |
| 3077.476272 | 0.821 |
| 3078.50484 | 0.825 |
| 3079.533408 | 0.829 |
| 3080.561977 | 0.834 |
| 3081.590545 | 0.838 |
| 3082.619113 | 0.842 |
| 3083.647681 | 0.845 |
| 3084.67625 | 0.848 |
| 3085.704818 | 0.851 |
| 3086.733386 | 0.855 |
| 3087.761955 | 0.859 |
| 3088.790523 | 0.863 |
| 3089.819091 | 0.868 |
| 3090.847659 | 0.873 |
| 3091.876228 | 0.878 |
| 3092.904796 | 0.883 |
| 3093.933364 | 0.887 |
| 3094.961932 | 0.892 |
| 3095.990501 | 0.896 |
| 3097.019069 | 0.901 |
| 3098.047637 | 0.906 |
| 3099.076206 | 0.911 |
| 3100.104774 | 0.916 |
| 3101.133342 | 0.92 |
| 3102.16191 | 0.924 |
| 3103.190479 | 0.928 |
| 3104.219047 | 0.932 |
| 3105.247615 | 0.937 |
| 3106.276183 | 0.942 |
| 3107.304752 | 0.946 |
| 3108.33332 | 0.951 |
| 3109.361888 | 0.955 |
| 3110.390457 | 0.959 |
| 3111.419025 | 0.963 |
| 3112.447593 | 0.967 |
| 3113.476161 | 0.972 |
| 3114.50473 | 0.977 |
| 3115.533298 | 0.983 |
| 3116.561866 | 0.989 |
| 3117.590434 | 0.995 |
| 3118.619003 | 1 |
| 3119.647571 | 1.006 |
| 3120.676139 | 1.011 |
| 3121.704708 | 1.015 |
| 3122.733276 | 1.02 |
| 3123.761844 | 1.024 |
| 3124.790412 | 1.028 |
| 3125.818981 | 1.031 |
| 3126.847549 | 1.035 |
| 3127.876117 | 1.039 |
| 3128.904685 | 1.044 |
| 3129.933254 | 1.049 |
| 3130.961822 | 1.054 |
| 3131.99039 | 1.06 |
| 3133.018959 | 1.066 |
| 3134.047527 | 1.071 |
| 3135.076095 | 1.077 |
| 3136.104663 | 1.082 |
| 3137.133232 | 1.087 |
| 3138.1618 | 1.091 |
| 3139.190368 | 1.096 |
| 3140.218936 | 1.1 |
| 3141.247505 | 1.105 |
| 3142.276073 | 1.11 |
| 3143.304641 | 1.115 |
| 3144.33321 | 1.121 |
| 3145.361778 | 1.126 |
| 3146.390346 | 1.132 |
| 3147.418914 | 1.137 |
| 3148.447483 | 1.142 |
| 3149.476051 | 1.147 |
| 3150.504619 | 1.152 |
| 3151.533187 | 1.157 |
| 3152.561756 | 1.163 |
| 3153.590324 | 1.169 |
| 3154.618892 | 1.176 |
| 3155.647461 | 1.182 |
| 3156.676029 | 1.187 |
| 3157.704597 | 1.193 |
| 3158.733165 | 1.198 |
| 3159.761734 | 1.203 |
| 3160.790302 | 1.209 |
| 3161.81887 | 1.214 |
| 3162.847438 | 1.22 |
| 3163.876007 | 1.226 |
| 3164.904575 | 1.231 |
| 3165.933143 | 1.236 |
| 3166.961712 | 1.241 |
| 3167.99028 | 1.247 |
| 3169.018848 | 1.252 |
| 3170.047416 | 1.258 |
| 3171.075985 | 1.264 |
| 3172.104553 | 1.27 |
| 3173.133121 | 1.275 |
| 3174.161689 | 1.28 |
| 3175.190258 | 1.285 |
| 3176.218826 | 1.29 |
| 3177.247394 | 1.295 |
| 3178.275963 | 1.301 |
| 3179.304531 | 1.307 |
| 3180.333099 | 1.313 |
| 3181.361667 | 1.319 |
| 3182.390236 | 1.325 |
| 3183.418804 | 1.331 |
| 3184.447372 | 1.337 |
| 3185.47594 | 1.343 |
| 3186.504509 | 1.348 |
| 3187.533077 | 1.354 |
| 3188.561645 | 1.36 |
| 3189.590214 | 1.366 |
| 3190.618782 | 1.372 |
| 3191.64735 | 1.378 |
| 3192.675918 | 1.384 |
| 3193.704487 | 1.39 |
| 3194.733055 | 1.396 |
| 3195.761623 | 1.401 |
| 3196.790191 | 1.407 |
| 3197.81876 | 1.413 |
| 3198.847328 | 1.419 |
| 3199.875896 | 1.425 |
| 3200.904465 | 1.432 |